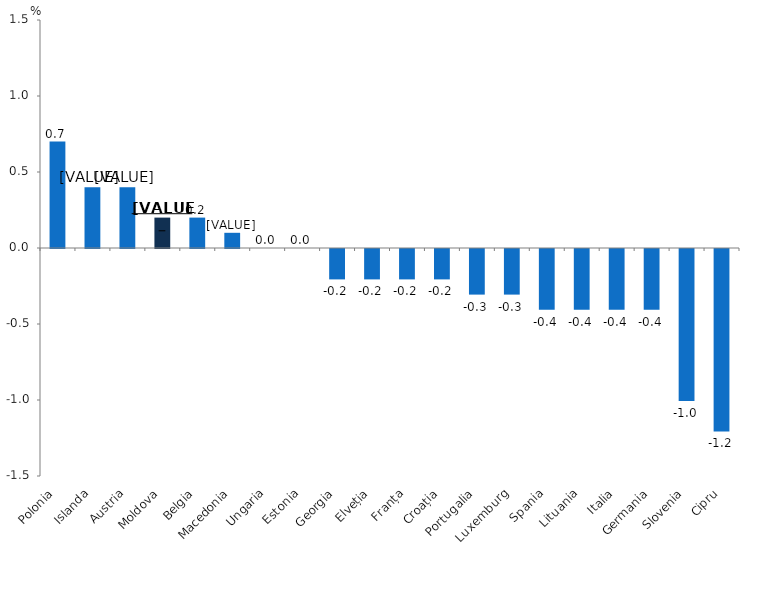
| Category | Series 0 |
|---|---|
| Polonia | 0.7 |
| Islanda | 0.4 |
| Austria | 0.4 |
| Moldova | 0.2 |
| Belgia | 0.2 |
| Macedonia | 0.1 |
| Ungaria | 0 |
| Estonia | 0 |
| Georgia | -0.2 |
| Elveția | -0.2 |
| Franța | -0.2 |
| Croația | -0.2 |
| Portugalia | -0.3 |
| Luxemburg | -0.3 |
| Spania | -0.4 |
| Lituania | -0.4 |
| Italia | -0.4 |
| Germania | -0.4 |
| Slovenia | -1 |
| Cipru | -1.2 |